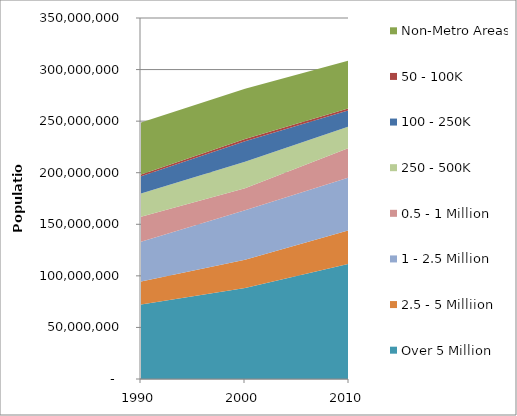
| Category | Over 5 Million | 2.5 - 5 Milliion | 1 - 2.5 Million | 0.5 - 1 Million | 250 - 500K | 100 - 250K | 50 - 100K | Non-Metro Areas |
|---|---|---|---|---|---|---|---|---|
| 1990.0 | 72154358 | 22289751 | 38629024 | 24351646 | 22397418 | 16809165 | 1606482 | 50472029 |
| 2000.0 | 88293653 | 27329564 | 48026722 | 21272896 | 25597240 | 19917234 | 2142631 | 48841966 |
| 2010.0 | 111811753 | 32472467 | 51131690 | 28595291 | 20778622 | 15733357 | 1928952 | 46293406 |